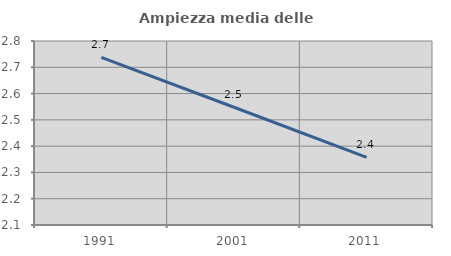
| Category | Ampiezza media delle famiglie |
|---|---|
| 1991.0 | 2.738 |
| 2001.0 | 2.548 |
| 2011.0 | 2.357 |